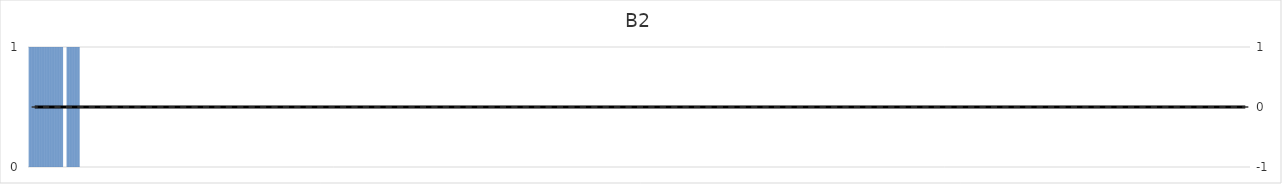
| Category | B2 |
|---|---|
| 1.0 | 0 |
| 2.0 | 1 |
| 3.0 | 1 |
| 4.0 | 1 |
| 5.0 | 1 |
| 6.0 | 1 |
| 7.0 | 1 |
| 8.0 | 1 |
| 9.0 | 1 |
| 10.0 | 1 |
| 11.0 | 1 |
| 12.0 | 1 |
| 13.0 | 1 |
| 14.0 | 1 |
| 15.0 | 1 |
| 16.0 | 1 |
| 17.0 | 1 |
| 18.0 | 1 |
| 19.0 | 1 |
| 20.0 | 1 |
| 21.0 | 1 |
| 22.0 | 1 |
| 23.0 | 1 |
| 24.0 | 1 |
| 25.0 | 1 |
| 26.0 | 1 |
| 27.0 | 1 |
| 28.0 | 1 |
| 29.0 | 1 |
| 30.0 | 1 |
| 31.0 | 1 |
| 32.0 | 1 |
| 33.0 | 1 |
| 34.0 | 1 |
| 35.0 | 1 |
| 36.0 | 1 |
| 37.0 | 1 |
| 38.0 | 1 |
| 39.0 | 1 |
| 40.0 | 1 |
| 41.0 | 1 |
| 42.0 | 1 |
| 43.0 | 1 |
| 44.0 | 1 |
| 45.0 | 1 |
| 46.0 | 1 |
| 47.0 | 1 |
| 48.0 | 1 |
| 49.0 | 1 |
| 50.0 | 0 |
| 51.0 | 0 |
| 52.0 | 0 |
| 53.0 | 0 |
| 54.0 | 0 |
| 55.0 | 1 |
| 56.0 | 1 |
| 57.0 | 1 |
| 58.0 | 1 |
| 59.0 | 1 |
| 60.0 | 1 |
| 61.0 | 1 |
| 62.0 | 1 |
| 63.0 | 1 |
| 64.0 | 1 |
| 65.0 | 1 |
| 66.0 | 1 |
| 67.0 | 1 |
| 68.0 | 1 |
| 69.0 | 1 |
| 70.0 | 1 |
| 71.0 | 1 |
| 72.0 | 1 |
| 73.0 | 0 |
| 74.0 | 0 |
| 75.0 | 0 |
| 76.0 | 0 |
| 77.0 | 0 |
| 78.0 | 0 |
| 79.0 | 0 |
| 80.0 | 0 |
| 81.0 | 0 |
| 82.0 | 0 |
| 83.0 | 0 |
| 84.0 | 0 |
| 85.0 | 0 |
| 86.0 | 0 |
| 87.0 | 0 |
| 88.0 | 0 |
| 89.0 | 0 |
| 90.0 | 0 |
| 91.0 | 0 |
| 92.0 | 0 |
| 93.0 | 0 |
| 94.0 | 0 |
| 95.0 | 0 |
| 96.0 | 0 |
| 97.0 | 0 |
| 98.0 | 0 |
| 99.0 | 0 |
| 100.0 | 0 |
| 101.0 | 0 |
| 102.0 | 0 |
| 103.0 | 0 |
| 104.0 | 0 |
| 105.0 | 0 |
| 106.0 | 0 |
| 107.0 | 0 |
| 108.0 | 0 |
| 109.0 | 0 |
| 110.0 | 0 |
| 111.0 | 0 |
| 112.0 | 0 |
| 113.0 | 0 |
| 114.0 | 0 |
| 115.0 | 0 |
| 116.0 | 0 |
| 117.0 | 0 |
| 118.0 | 0 |
| 119.0 | 0 |
| 120.0 | 0 |
| 121.0 | 0 |
| 122.0 | 0 |
| 123.0 | 0 |
| 124.0 | 0 |
| 125.0 | 0 |
| 126.0 | 0 |
| 127.0 | 0 |
| 128.0 | 0 |
| 129.0 | 0 |
| 130.0 | 0 |
| 131.0 | 0 |
| 132.0 | 0 |
| 133.0 | 0 |
| 134.0 | 0 |
| 135.0 | 0 |
| 136.0 | 0 |
| 137.0 | 0 |
| 138.0 | 0 |
| 139.0 | 0 |
| 140.0 | 0 |
| 141.0 | 0 |
| 142.0 | 0 |
| 143.0 | 0 |
| 144.0 | 0 |
| 145.0 | 0 |
| 146.0 | 0 |
| 147.0 | 0 |
| 148.0 | 0 |
| 149.0 | 0 |
| 150.0 | 0 |
| 151.0 | 0 |
| 152.0 | 0 |
| 153.0 | 0 |
| 154.0 | 0 |
| 155.0 | 0 |
| 156.0 | 0 |
| 157.0 | 0 |
| 158.0 | 0 |
| 159.0 | 0 |
| 160.0 | 0 |
| 161.0 | 0 |
| 162.0 | 0 |
| 163.0 | 0 |
| 164.0 | 0 |
| 165.0 | 0 |
| 166.0 | 0 |
| 167.0 | 0 |
| 168.0 | 0 |
| 169.0 | 0 |
| 170.0 | 0 |
| 171.0 | 0 |
| 172.0 | 0 |
| 173.0 | 0 |
| 174.0 | 0 |
| 175.0 | 0 |
| 176.0 | 0 |
| 177.0 | 0 |
| 178.0 | 0 |
| 179.0 | 0 |
| 180.0 | 0 |
| 181.0 | 0 |
| 182.0 | 0 |
| 183.0 | 0 |
| 184.0 | 0 |
| 185.0 | 0 |
| 186.0 | 0 |
| 187.0 | 0 |
| 188.0 | 0 |
| 189.0 | 0 |
| 190.0 | 0 |
| 191.0 | 0 |
| 192.0 | 0 |
| 193.0 | 0 |
| 194.0 | 0 |
| 195.0 | 0 |
| 196.0 | 0 |
| 197.0 | 0 |
| 198.0 | 0 |
| 199.0 | 0 |
| 200.0 | 0 |
| 201.0 | 0 |
| 202.0 | 0 |
| 203.0 | 0 |
| 204.0 | 0 |
| 205.0 | 0 |
| 206.0 | 0 |
| 207.0 | 0 |
| 208.0 | 0 |
| 209.0 | 0 |
| 210.0 | 0 |
| 211.0 | 0 |
| 212.0 | 0 |
| 213.0 | 0 |
| 214.0 | 0 |
| 215.0 | 0 |
| 216.0 | 0 |
| 217.0 | 0 |
| 218.0 | 0 |
| 219.0 | 0 |
| 220.0 | 0 |
| 221.0 | 0 |
| 222.0 | 0 |
| 223.0 | 0 |
| 224.0 | 0 |
| 225.0 | 0 |
| 226.0 | 0 |
| 227.0 | 0 |
| 228.0 | 0 |
| 229.0 | 0 |
| 230.0 | 0 |
| 231.0 | 0 |
| 232.0 | 0 |
| 233.0 | 0 |
| 234.0 | 0 |
| 235.0 | 0 |
| 236.0 | 0 |
| 237.0 | 0 |
| 238.0 | 0 |
| 239.0 | 0 |
| 240.0 | 0 |
| 241.0 | 0 |
| 242.0 | 0 |
| 243.0 | 0 |
| 244.0 | 0 |
| 245.0 | 0 |
| 246.0 | 0 |
| 247.0 | 0 |
| 248.0 | 0 |
| 249.0 | 0 |
| 250.0 | 0 |
| 251.0 | 0 |
| 252.0 | 0 |
| 253.0 | 0 |
| 254.0 | 0 |
| 255.0 | 0 |
| 256.0 | 0 |
| 257.0 | 0 |
| 258.0 | 0 |
| 259.0 | 0 |
| 260.0 | 0 |
| 261.0 | 0 |
| 262.0 | 0 |
| 263.0 | 0 |
| 264.0 | 0 |
| 265.0 | 0 |
| 266.0 | 0 |
| 267.0 | 0 |
| 268.0 | 0 |
| 269.0 | 0 |
| 270.0 | 0 |
| 271.0 | 0 |
| 272.0 | 0 |
| 273.0 | 0 |
| 274.0 | 0 |
| 275.0 | 0 |
| 276.0 | 0 |
| 277.0 | 0 |
| 278.0 | 0 |
| 279.0 | 0 |
| 280.0 | 0 |
| 281.0 | 0 |
| 282.0 | 0 |
| 283.0 | 0 |
| 284.0 | 0 |
| 285.0 | 0 |
| 286.0 | 0 |
| 287.0 | 0 |
| 288.0 | 0 |
| 289.0 | 0 |
| 290.0 | 0 |
| 291.0 | 0 |
| 292.0 | 0 |
| 293.0 | 0 |
| 294.0 | 0 |
| 295.0 | 0 |
| 296.0 | 0 |
| 297.0 | 0 |
| 298.0 | 0 |
| 299.0 | 0 |
| 300.0 | 0 |
| 301.0 | 0 |
| 302.0 | 0 |
| 303.0 | 0 |
| 304.0 | 0 |
| 305.0 | 0 |
| 306.0 | 0 |
| 307.0 | 0 |
| 308.0 | 0 |
| 309.0 | 0 |
| 310.0 | 0 |
| 311.0 | 0 |
| 312.0 | 0 |
| 313.0 | 0 |
| 314.0 | 0 |
| 315.0 | 0 |
| 316.0 | 0 |
| 317.0 | 0 |
| 318.0 | 0 |
| 319.0 | 0 |
| 320.0 | 0 |
| 321.0 | 0 |
| 322.0 | 0 |
| 323.0 | 0 |
| 324.0 | 0 |
| 325.0 | 0 |
| 326.0 | 0 |
| 327.0 | 0 |
| 328.0 | 0 |
| 329.0 | 0 |
| 330.0 | 0 |
| 331.0 | 0 |
| 332.0 | 0 |
| 333.0 | 0 |
| 334.0 | 0 |
| 335.0 | 0 |
| 336.0 | 0 |
| 337.0 | 0 |
| 338.0 | 0 |
| 339.0 | 0 |
| 340.0 | 0 |
| 341.0 | 0 |
| 342.0 | 0 |
| 343.0 | 0 |
| 344.0 | 0 |
| 345.0 | 0 |
| 346.0 | 0 |
| 347.0 | 0 |
| 348.0 | 0 |
| 349.0 | 0 |
| 350.0 | 0 |
| 351.0 | 0 |
| 352.0 | 0 |
| 353.0 | 0 |
| 354.0 | 0 |
| 355.0 | 0 |
| 356.0 | 0 |
| 357.0 | 0 |
| 358.0 | 0 |
| 359.0 | 0 |
| 360.0 | 0 |
| 361.0 | 0 |
| 362.0 | 0 |
| 363.0 | 0 |
| 364.0 | 0 |
| 365.0 | 0 |
| 366.0 | 0 |
| 367.0 | 0 |
| 368.0 | 0 |
| 369.0 | 0 |
| 370.0 | 0 |
| 371.0 | 0 |
| 372.0 | 0 |
| 373.0 | 0 |
| 374.0 | 0 |
| 375.0 | 0 |
| 376.0 | 0 |
| 377.0 | 0 |
| 378.0 | 0 |
| 379.0 | 0 |
| 380.0 | 0 |
| 381.0 | 0 |
| 382.0 | 0 |
| 383.0 | 0 |
| 384.0 | 0 |
| 385.0 | 0 |
| 386.0 | 0 |
| 387.0 | 0 |
| 388.0 | 0 |
| 389.0 | 0 |
| 390.0 | 0 |
| 391.0 | 0 |
| 392.0 | 0 |
| 393.0 | 0 |
| 394.0 | 0 |
| 395.0 | 0 |
| 396.0 | 0 |
| 397.0 | 0 |
| 398.0 | 0 |
| 399.0 | 0 |
| 400.0 | 0 |
| 401.0 | 0 |
| 402.0 | 0 |
| 403.0 | 0 |
| 404.0 | 0 |
| 405.0 | 0 |
| 406.0 | 0 |
| 407.0 | 0 |
| 408.0 | 0 |
| 409.0 | 0 |
| 410.0 | 0 |
| 411.0 | 0 |
| 412.0 | 0 |
| 413.0 | 0 |
| 414.0 | 0 |
| 415.0 | 0 |
| 416.0 | 0 |
| 417.0 | 0 |
| 418.0 | 0 |
| 419.0 | 0 |
| 420.0 | 0 |
| 421.0 | 0 |
| 422.0 | 0 |
| 423.0 | 0 |
| 424.0 | 0 |
| 425.0 | 0 |
| 426.0 | 0 |
| 427.0 | 0 |
| 428.0 | 0 |
| 429.0 | 0 |
| 430.0 | 0 |
| 431.0 | 0 |
| 432.0 | 0 |
| 433.0 | 0 |
| 434.0 | 0 |
| 435.0 | 0 |
| 436.0 | 0 |
| 437.0 | 0 |
| 438.0 | 0 |
| 439.0 | 0 |
| 440.0 | 0 |
| 441.0 | 0 |
| 442.0 | 0 |
| 443.0 | 0 |
| 444.0 | 0 |
| 445.0 | 0 |
| 446.0 | 0 |
| 447.0 | 0 |
| 448.0 | 0 |
| 449.0 | 0 |
| 450.0 | 0 |
| 451.0 | 0 |
| 452.0 | 0 |
| 453.0 | 0 |
| 454.0 | 0 |
| 455.0 | 0 |
| 456.0 | 0 |
| 457.0 | 0 |
| 458.0 | 0 |
| 459.0 | 0 |
| 460.0 | 0 |
| 461.0 | 0 |
| 462.0 | 0 |
| 463.0 | 0 |
| 464.0 | 0 |
| 465.0 | 0 |
| 466.0 | 0 |
| 467.0 | 0 |
| 468.0 | 0 |
| 469.0 | 0 |
| 470.0 | 0 |
| 471.0 | 0 |
| 472.0 | 0 |
| 473.0 | 0 |
| 474.0 | 0 |
| 475.0 | 0 |
| 476.0 | 0 |
| 477.0 | 0 |
| 478.0 | 0 |
| 479.0 | 0 |
| 480.0 | 0 |
| 481.0 | 0 |
| 482.0 | 0 |
| 483.0 | 0 |
| 484.0 | 0 |
| 485.0 | 0 |
| 486.0 | 0 |
| 487.0 | 0 |
| 488.0 | 0 |
| 489.0 | 0 |
| 490.0 | 0 |
| 491.0 | 0 |
| 492.0 | 0 |
| 493.0 | 0 |
| 494.0 | 0 |
| 495.0 | 0 |
| 496.0 | 0 |
| 497.0 | 0 |
| 498.0 | 0 |
| 499.0 | 0 |
| 500.0 | 0 |
| 501.0 | 0 |
| 502.0 | 0 |
| 503.0 | 0 |
| 504.0 | 0 |
| 505.0 | 0 |
| 506.0 | 0 |
| 507.0 | 0 |
| 508.0 | 0 |
| 509.0 | 0 |
| 510.0 | 0 |
| 511.0 | 0 |
| 512.0 | 0 |
| 513.0 | 0 |
| 514.0 | 0 |
| 515.0 | 0 |
| 516.0 | 0 |
| 517.0 | 0 |
| 518.0 | 0 |
| 519.0 | 0 |
| 520.0 | 0 |
| 521.0 | 0 |
| 522.0 | 0 |
| 523.0 | 0 |
| 524.0 | 0 |
| 525.0 | 0 |
| 526.0 | 0 |
| 527.0 | 0 |
| 528.0 | 0 |
| 529.0 | 0 |
| 530.0 | 0 |
| 531.0 | 0 |
| 532.0 | 0 |
| 533.0 | 0 |
| 534.0 | 0 |
| 535.0 | 0 |
| 536.0 | 0 |
| 537.0 | 0 |
| 538.0 | 0 |
| 539.0 | 0 |
| 540.0 | 0 |
| 541.0 | 0 |
| 542.0 | 0 |
| 543.0 | 0 |
| 544.0 | 0 |
| 545.0 | 0 |
| 546.0 | 0 |
| 547.0 | 0 |
| 548.0 | 0 |
| 549.0 | 0 |
| 550.0 | 0 |
| 551.0 | 0 |
| 552.0 | 0 |
| 553.0 | 0 |
| 554.0 | 0 |
| 555.0 | 0 |
| 556.0 | 0 |
| 557.0 | 0 |
| 558.0 | 0 |
| 559.0 | 0 |
| 560.0 | 0 |
| 561.0 | 0 |
| 562.0 | 0 |
| 563.0 | 0 |
| 564.0 | 0 |
| 565.0 | 0 |
| 566.0 | 0 |
| 567.0 | 0 |
| 568.0 | 0 |
| 569.0 | 0 |
| 570.0 | 0 |
| 571.0 | 0 |
| 572.0 | 0 |
| 573.0 | 0 |
| 574.0 | 0 |
| 575.0 | 0 |
| 576.0 | 0 |
| 577.0 | 0 |
| 578.0 | 0 |
| 579.0 | 0 |
| 580.0 | 0 |
| 581.0 | 0 |
| 582.0 | 0 |
| 583.0 | 0 |
| 584.0 | 0 |
| 585.0 | 0 |
| 586.0 | 0 |
| 587.0 | 0 |
| 588.0 | 0 |
| 589.0 | 0 |
| 590.0 | 0 |
| 591.0 | 0 |
| 592.0 | 0 |
| 593.0 | 0 |
| 594.0 | 0 |
| 595.0 | 0 |
| 596.0 | 0 |
| 597.0 | 0 |
| 598.0 | 0 |
| 599.0 | 0 |
| 600.0 | 0 |
| 601.0 | 0 |
| 602.0 | 0 |
| 603.0 | 0 |
| 604.0 | 0 |
| 605.0 | 0 |
| 606.0 | 0 |
| 607.0 | 0 |
| 608.0 | 0 |
| 609.0 | 0 |
| 610.0 | 0 |
| 611.0 | 0 |
| 612.0 | 0 |
| 613.0 | 0 |
| 614.0 | 0 |
| 615.0 | 0 |
| 616.0 | 0 |
| 617.0 | 0 |
| 618.0 | 0 |
| 619.0 | 0 |
| 620.0 | 0 |
| 621.0 | 0 |
| 622.0 | 0 |
| 623.0 | 0 |
| 624.0 | 0 |
| 625.0 | 0 |
| 626.0 | 0 |
| 627.0 | 0 |
| 628.0 | 0 |
| 629.0 | 0 |
| 630.0 | 0 |
| 631.0 | 0 |
| 632.0 | 0 |
| 633.0 | 0 |
| 634.0 | 0 |
| 635.0 | 0 |
| 636.0 | 0 |
| 637.0 | 0 |
| 638.0 | 0 |
| 639.0 | 0 |
| 640.0 | 0 |
| 641.0 | 0 |
| 642.0 | 0 |
| 643.0 | 0 |
| 644.0 | 0 |
| 645.0 | 0 |
| 646.0 | 0 |
| 647.0 | 0 |
| 648.0 | 0 |
| 649.0 | 0 |
| 650.0 | 0 |
| 651.0 | 0 |
| 652.0 | 0 |
| 653.0 | 0 |
| 654.0 | 0 |
| 655.0 | 0 |
| 656.0 | 0 |
| 657.0 | 0 |
| 658.0 | 0 |
| 659.0 | 0 |
| 660.0 | 0 |
| 661.0 | 0 |
| 662.0 | 0 |
| 663.0 | 0 |
| 664.0 | 0 |
| 665.0 | 0 |
| 666.0 | 0 |
| 667.0 | 0 |
| 668.0 | 0 |
| 669.0 | 0 |
| 670.0 | 0 |
| 671.0 | 0 |
| 672.0 | 0 |
| 673.0 | 0 |
| 674.0 | 0 |
| 675.0 | 0 |
| 676.0 | 0 |
| 677.0 | 0 |
| 678.0 | 0 |
| 679.0 | 0 |
| 680.0 | 0 |
| 681.0 | 0 |
| 682.0 | 0 |
| 683.0 | 0 |
| 684.0 | 0 |
| 685.0 | 0 |
| 686.0 | 0 |
| 687.0 | 0 |
| 688.0 | 0 |
| 689.0 | 0 |
| 690.0 | 0 |
| 691.0 | 0 |
| 692.0 | 0 |
| 693.0 | 0 |
| 694.0 | 0 |
| 695.0 | 0 |
| 696.0 | 0 |
| 697.0 | 0 |
| 698.0 | 0 |
| 699.0 | 0 |
| 700.0 | 0 |
| 701.0 | 0 |
| 702.0 | 0 |
| 703.0 | 0 |
| 704.0 | 0 |
| 705.0 | 0 |
| 706.0 | 0 |
| 707.0 | 0 |
| 708.0 | 0 |
| 709.0 | 0 |
| 710.0 | 0 |
| 711.0 | 0 |
| 712.0 | 0 |
| 713.0 | 0 |
| 714.0 | 0 |
| 715.0 | 0 |
| 716.0 | 0 |
| 717.0 | 0 |
| 718.0 | 0 |
| 719.0 | 0 |
| 720.0 | 0 |
| 721.0 | 0 |
| 722.0 | 0 |
| 723.0 | 0 |
| 724.0 | 0 |
| 725.0 | 0 |
| 726.0 | 0 |
| 727.0 | 0 |
| 728.0 | 0 |
| 729.0 | 0 |
| 730.0 | 0 |
| 731.0 | 0 |
| 732.0 | 0 |
| 733.0 | 0 |
| 734.0 | 0 |
| 735.0 | 0 |
| 736.0 | 0 |
| 737.0 | 0 |
| 738.0 | 0 |
| 739.0 | 0 |
| 740.0 | 0 |
| 741.0 | 0 |
| 742.0 | 0 |
| 743.0 | 0 |
| 744.0 | 0 |
| 745.0 | 0 |
| 746.0 | 0 |
| 747.0 | 0 |
| 748.0 | 0 |
| 749.0 | 0 |
| 750.0 | 0 |
| 751.0 | 0 |
| 752.0 | 0 |
| 753.0 | 0 |
| 754.0 | 0 |
| 755.0 | 0 |
| 756.0 | 0 |
| 757.0 | 0 |
| 758.0 | 0 |
| 759.0 | 0 |
| 760.0 | 0 |
| 761.0 | 0 |
| 762.0 | 0 |
| 763.0 | 0 |
| 764.0 | 0 |
| 765.0 | 0 |
| 766.0 | 0 |
| 767.0 | 0 |
| 768.0 | 0 |
| 769.0 | 0 |
| 770.0 | 0 |
| 771.0 | 0 |
| 772.0 | 0 |
| 773.0 | 0 |
| 774.0 | 0 |
| 775.0 | 0 |
| 776.0 | 0 |
| 777.0 | 0 |
| 778.0 | 0 |
| 779.0 | 0 |
| 780.0 | 0 |
| 781.0 | 0 |
| 782.0 | 0 |
| 783.0 | 0 |
| 784.0 | 0 |
| 785.0 | 0 |
| 786.0 | 0 |
| 787.0 | 0 |
| 788.0 | 0 |
| 789.0 | 0 |
| 790.0 | 0 |
| 791.0 | 0 |
| 792.0 | 0 |
| 793.0 | 0 |
| 794.0 | 0 |
| 795.0 | 0 |
| 796.0 | 0 |
| 797.0 | 0 |
| 798.0 | 0 |
| 799.0 | 0 |
| 800.0 | 0 |
| 801.0 | 0 |
| 802.0 | 0 |
| 803.0 | 0 |
| 804.0 | 0 |
| 805.0 | 0 |
| 806.0 | 0 |
| 807.0 | 0 |
| 808.0 | 0 |
| 809.0 | 0 |
| 810.0 | 0 |
| 811.0 | 0 |
| 812.0 | 0 |
| 813.0 | 0 |
| 814.0 | 0 |
| 815.0 | 0 |
| 816.0 | 0 |
| 817.0 | 0 |
| 818.0 | 0 |
| 819.0 | 0 |
| 820.0 | 0 |
| 821.0 | 0 |
| 822.0 | 0 |
| 823.0 | 0 |
| 824.0 | 0 |
| 825.0 | 0 |
| 826.0 | 0 |
| 827.0 | 0 |
| 828.0 | 0 |
| 829.0 | 0 |
| 830.0 | 0 |
| 831.0 | 0 |
| 832.0 | 0 |
| 833.0 | 0 |
| 834.0 | 0 |
| 835.0 | 0 |
| 836.0 | 0 |
| 837.0 | 0 |
| 838.0 | 0 |
| 839.0 | 0 |
| 840.0 | 0 |
| 841.0 | 0 |
| 842.0 | 0 |
| 843.0 | 0 |
| 844.0 | 0 |
| 845.0 | 0 |
| 846.0 | 0 |
| 847.0 | 0 |
| 848.0 | 0 |
| 849.0 | 0 |
| 850.0 | 0 |
| 851.0 | 0 |
| 852.0 | 0 |
| 853.0 | 0 |
| 854.0 | 0 |
| 855.0 | 0 |
| 856.0 | 0 |
| 857.0 | 0 |
| 858.0 | 0 |
| 859.0 | 0 |
| 860.0 | 0 |
| 861.0 | 0 |
| 862.0 | 0 |
| 863.0 | 0 |
| 864.0 | 0 |
| 865.0 | 0 |
| 866.0 | 0 |
| 867.0 | 0 |
| 868.0 | 0 |
| 869.0 | 0 |
| 870.0 | 0 |
| 871.0 | 0 |
| 872.0 | 0 |
| 873.0 | 0 |
| 874.0 | 0 |
| 875.0 | 0 |
| 876.0 | 0 |
| 877.0 | 0 |
| 878.0 | 0 |
| 879.0 | 0 |
| 880.0 | 0 |
| 881.0 | 0 |
| 882.0 | 0 |
| 883.0 | 0 |
| 884.0 | 0 |
| 885.0 | 0 |
| 886.0 | 0 |
| 887.0 | 0 |
| 888.0 | 0 |
| 889.0 | 0 |
| 890.0 | 0 |
| 891.0 | 0 |
| 892.0 | 0 |
| 893.0 | 0 |
| 894.0 | 0 |
| 895.0 | 0 |
| 896.0 | 0 |
| 897.0 | 0 |
| 898.0 | 0 |
| 899.0 | 0 |
| 900.0 | 0 |
| 901.0 | 0 |
| 902.0 | 0 |
| 903.0 | 0 |
| 904.0 | 0 |
| 905.0 | 0 |
| 906.0 | 0 |
| 907.0 | 0 |
| 908.0 | 0 |
| 909.0 | 0 |
| 910.0 | 0 |
| 911.0 | 0 |
| 912.0 | 0 |
| 913.0 | 0 |
| 914.0 | 0 |
| 915.0 | 0 |
| 916.0 | 0 |
| 917.0 | 0 |
| 918.0 | 0 |
| 919.0 | 0 |
| 920.0 | 0 |
| 921.0 | 0 |
| 922.0 | 0 |
| 923.0 | 0 |
| 924.0 | 0 |
| 925.0 | 0 |
| 926.0 | 0 |
| 927.0 | 0 |
| 928.0 | 0 |
| 929.0 | 0 |
| 930.0 | 0 |
| 931.0 | 0 |
| 932.0 | 0 |
| 933.0 | 0 |
| 934.0 | 0 |
| 935.0 | 0 |
| 936.0 | 0 |
| 937.0 | 0 |
| 938.0 | 0 |
| 939.0 | 0 |
| 940.0 | 0 |
| 941.0 | 0 |
| 942.0 | 0 |
| 943.0 | 0 |
| 944.0 | 0 |
| 945.0 | 0 |
| 946.0 | 0 |
| 947.0 | 0 |
| 948.0 | 0 |
| 949.0 | 0 |
| 950.0 | 0 |
| 951.0 | 0 |
| 952.0 | 0 |
| 953.0 | 0 |
| 954.0 | 0 |
| 955.0 | 0 |
| 956.0 | 0 |
| 957.0 | 0 |
| 958.0 | 0 |
| 959.0 | 0 |
| 960.0 | 0 |
| 961.0 | 0 |
| 962.0 | 0 |
| 963.0 | 0 |
| 964.0 | 0 |
| 965.0 | 0 |
| 966.0 | 0 |
| 967.0 | 0 |
| 968.0 | 0 |
| 969.0 | 0 |
| 970.0 | 0 |
| 971.0 | 0 |
| 972.0 | 0 |
| 973.0 | 0 |
| 974.0 | 0 |
| 975.0 | 0 |
| 976.0 | 0 |
| 977.0 | 0 |
| 978.0 | 0 |
| 979.0 | 0 |
| 980.0 | 0 |
| 981.0 | 0 |
| 982.0 | 0 |
| 983.0 | 0 |
| 984.0 | 0 |
| 985.0 | 0 |
| 986.0 | 0 |
| 987.0 | 0 |
| 988.0 | 0 |
| 989.0 | 0 |
| 990.0 | 0 |
| 991.0 | 0 |
| 992.0 | 0 |
| 993.0 | 0 |
| 994.0 | 0 |
| 995.0 | 0 |
| 996.0 | 0 |
| 997.0 | 0 |
| 998.0 | 0 |
| 999.0 | 0 |
| 1000.0 | 0 |
| 1001.0 | 0 |
| 1002.0 | 0 |
| 1003.0 | 0 |
| 1004.0 | 0 |
| 1005.0 | 0 |
| 1006.0 | 0 |
| 1007.0 | 0 |
| 1008.0 | 0 |
| 1009.0 | 0 |
| 1010.0 | 0 |
| 1011.0 | 0 |
| 1012.0 | 0 |
| 1013.0 | 0 |
| 1014.0 | 0 |
| 1015.0 | 0 |
| 1016.0 | 0 |
| 1017.0 | 0 |
| 1018.0 | 0 |
| 1019.0 | 0 |
| 1020.0 | 0 |
| 1021.0 | 0 |
| 1022.0 | 0 |
| 1023.0 | 0 |
| 1024.0 | 0 |
| 1025.0 | 0 |
| 1026.0 | 0 |
| 1027.0 | 0 |
| 1028.0 | 0 |
| 1029.0 | 0 |
| 1030.0 | 0 |
| 1031.0 | 0 |
| 1032.0 | 0 |
| 1033.0 | 0 |
| 1034.0 | 0 |
| 1035.0 | 0 |
| 1036.0 | 0 |
| 1037.0 | 0 |
| 1038.0 | 0 |
| 1039.0 | 0 |
| 1040.0 | 0 |
| 1041.0 | 0 |
| 1042.0 | 0 |
| 1043.0 | 0 |
| 1044.0 | 0 |
| 1045.0 | 0 |
| 1046.0 | 0 |
| 1047.0 | 0 |
| 1048.0 | 0 |
| 1049.0 | 0 |
| 1050.0 | 0 |
| 1051.0 | 0 |
| 1052.0 | 0 |
| 1053.0 | 0 |
| 1054.0 | 0 |
| 1055.0 | 0 |
| 1056.0 | 0 |
| 1057.0 | 0 |
| 1058.0 | 0 |
| 1059.0 | 0 |
| 1060.0 | 0 |
| 1061.0 | 0 |
| 1062.0 | 0 |
| 1063.0 | 0 |
| 1064.0 | 0 |
| 1065.0 | 0 |
| 1066.0 | 0 |
| 1067.0 | 0 |
| 1068.0 | 0 |
| 1069.0 | 0 |
| 1070.0 | 0 |
| 1071.0 | 0 |
| 1072.0 | 0 |
| 1073.0 | 0 |
| 1074.0 | 0 |
| 1075.0 | 0 |
| 1076.0 | 0 |
| 1077.0 | 0 |
| 1078.0 | 0 |
| 1079.0 | 0 |
| 1080.0 | 0 |
| 1081.0 | 0 |
| 1082.0 | 0 |
| 1083.0 | 0 |
| 1084.0 | 0 |
| 1085.0 | 0 |
| 1086.0 | 0 |
| 1087.0 | 0 |
| 1088.0 | 0 |
| 1089.0 | 0 |
| 1090.0 | 0 |
| 1091.0 | 0 |
| 1092.0 | 0 |
| 1093.0 | 0 |
| 1094.0 | 0 |
| 1095.0 | 0 |
| 1096.0 | 0 |
| 1097.0 | 0 |
| 1098.0 | 0 |
| 1099.0 | 0 |
| 1100.0 | 0 |
| 1101.0 | 0 |
| 1102.0 | 0 |
| 1103.0 | 0 |
| 1104.0 | 0 |
| 1105.0 | 0 |
| 1106.0 | 0 |
| 1107.0 | 0 |
| 1108.0 | 0 |
| 1109.0 | 0 |
| 1110.0 | 0 |
| 1111.0 | 0 |
| 1112.0 | 0 |
| 1113.0 | 0 |
| 1114.0 | 0 |
| 1115.0 | 0 |
| 1116.0 | 0 |
| 1117.0 | 0 |
| 1118.0 | 0 |
| 1119.0 | 0 |
| 1120.0 | 0 |
| 1121.0 | 0 |
| 1122.0 | 0 |
| 1123.0 | 0 |
| 1124.0 | 0 |
| 1125.0 | 0 |
| 1126.0 | 0 |
| 1127.0 | 0 |
| 1128.0 | 0 |
| 1129.0 | 0 |
| 1130.0 | 0 |
| 1131.0 | 0 |
| 1132.0 | 0 |
| 1133.0 | 0 |
| 1134.0 | 0 |
| 1135.0 | 0 |
| 1136.0 | 0 |
| 1137.0 | 0 |
| 1138.0 | 0 |
| 1139.0 | 0 |
| 1140.0 | 0 |
| 1141.0 | 0 |
| 1142.0 | 0 |
| 1143.0 | 0 |
| 1144.0 | 0 |
| 1145.0 | 0 |
| 1146.0 | 0 |
| 1147.0 | 0 |
| 1148.0 | 0 |
| 1149.0 | 0 |
| 1150.0 | 0 |
| 1151.0 | 0 |
| 1152.0 | 0 |
| 1153.0 | 0 |
| 1154.0 | 0 |
| 1155.0 | 0 |
| 1156.0 | 0 |
| 1157.0 | 0 |
| 1158.0 | 0 |
| 1159.0 | 0 |
| 1160.0 | 0 |
| 1161.0 | 0 |
| 1162.0 | 0 |
| 1163.0 | 0 |
| 1164.0 | 0 |
| 1165.0 | 0 |
| 1166.0 | 0 |
| 1167.0 | 0 |
| 1168.0 | 0 |
| 1169.0 | 0 |
| 1170.0 | 0 |
| 1171.0 | 0 |
| 1172.0 | 0 |
| 1173.0 | 0 |
| 1174.0 | 0 |
| 1175.0 | 0 |
| 1176.0 | 0 |
| 1177.0 | 0 |
| 1178.0 | 0 |
| 1179.0 | 0 |
| 1180.0 | 0 |
| 1181.0 | 0 |
| 1182.0 | 0 |
| 1183.0 | 0 |
| 1184.0 | 0 |
| 1185.0 | 0 |
| 1186.0 | 0 |
| 1187.0 | 0 |
| 1188.0 | 0 |
| 1189.0 | 0 |
| 1190.0 | 0 |
| 1191.0 | 0 |
| 1192.0 | 0 |
| 1193.0 | 0 |
| 1194.0 | 0 |
| 1195.0 | 0 |
| 1196.0 | 0 |
| 1197.0 | 0 |
| 1198.0 | 0 |
| 1199.0 | 0 |
| 1200.0 | 0 |
| 1201.0 | 0 |
| 1202.0 | 0 |
| 1203.0 | 0 |
| 1204.0 | 0 |
| 1205.0 | 0 |
| 1206.0 | 0 |
| 1207.0 | 0 |
| 1208.0 | 0 |
| 1209.0 | 0 |
| 1210.0 | 0 |
| 1211.0 | 0 |
| 1212.0 | 0 |
| 1213.0 | 0 |
| 1214.0 | 0 |
| 1215.0 | 0 |
| 1216.0 | 0 |
| 1217.0 | 0 |
| 1218.0 | 0 |
| 1219.0 | 0 |
| 1220.0 | 0 |
| 1221.0 | 0 |
| 1222.0 | 0 |
| 1223.0 | 0 |
| 1224.0 | 0 |
| 1225.0 | 0 |
| 1226.0 | 0 |
| 1227.0 | 0 |
| 1228.0 | 0 |
| 1229.0 | 0 |
| 1230.0 | 0 |
| 1231.0 | 0 |
| 1232.0 | 0 |
| 1233.0 | 0 |
| 1234.0 | 0 |
| 1235.0 | 0 |
| 1236.0 | 0 |
| 1237.0 | 0 |
| 1238.0 | 0 |
| 1239.0 | 0 |
| 1240.0 | 0 |
| 1241.0 | 0 |
| 1242.0 | 0 |
| 1243.0 | 0 |
| 1244.0 | 0 |
| 1245.0 | 0 |
| 1246.0 | 0 |
| 1247.0 | 0 |
| 1248.0 | 0 |
| 1249.0 | 0 |
| 1250.0 | 0 |
| 1251.0 | 0 |
| 1252.0 | 0 |
| 1253.0 | 0 |
| 1254.0 | 0 |
| 1255.0 | 0 |
| 1256.0 | 0 |
| 1257.0 | 0 |
| 1258.0 | 0 |
| 1259.0 | 0 |
| 1260.0 | 0 |
| 1261.0 | 0 |
| 1262.0 | 0 |
| 1263.0 | 0 |
| 1264.0 | 0 |
| 1265.0 | 0 |
| 1266.0 | 0 |
| 1267.0 | 0 |
| 1268.0 | 0 |
| 1269.0 | 0 |
| 1270.0 | 0 |
| 1271.0 | 0 |
| 1272.0 | 0 |
| 1273.0 | 0 |
| 1274.0 | 0 |
| 1275.0 | 0 |
| 1276.0 | 0 |
| 1277.0 | 0 |
| 1278.0 | 0 |
| 1279.0 | 0 |
| 1280.0 | 0 |
| 1281.0 | 0 |
| 1282.0 | 0 |
| 1283.0 | 0 |
| 1284.0 | 0 |
| 1285.0 | 0 |
| 1286.0 | 0 |
| 1287.0 | 0 |
| 1288.0 | 0 |
| 1289.0 | 0 |
| 1290.0 | 0 |
| 1291.0 | 0 |
| 1292.0 | 0 |
| 1293.0 | 0 |
| 1294.0 | 0 |
| 1295.0 | 0 |
| 1296.0 | 0 |
| 1297.0 | 0 |
| 1298.0 | 0 |
| 1299.0 | 0 |
| 1300.0 | 0 |
| 1301.0 | 0 |
| 1302.0 | 0 |
| 1303.0 | 0 |
| 1304.0 | 0 |
| 1305.0 | 0 |
| 1306.0 | 0 |
| 1307.0 | 0 |
| 1308.0 | 0 |
| 1309.0 | 0 |
| 1310.0 | 0 |
| 1311.0 | 0 |
| 1312.0 | 0 |
| 1313.0 | 0 |
| 1314.0 | 0 |
| 1315.0 | 0 |
| 1316.0 | 0 |
| 1317.0 | 0 |
| 1318.0 | 0 |
| 1319.0 | 0 |
| 1320.0 | 0 |
| 1321.0 | 0 |
| 1322.0 | 0 |
| 1323.0 | 0 |
| 1324.0 | 0 |
| 1325.0 | 0 |
| 1326.0 | 0 |
| 1327.0 | 0 |
| 1328.0 | 0 |
| 1329.0 | 0 |
| 1330.0 | 0 |
| 1331.0 | 0 |
| 1332.0 | 0 |
| 1333.0 | 0 |
| 1334.0 | 0 |
| 1335.0 | 0 |
| 1336.0 | 0 |
| 1337.0 | 0 |
| 1338.0 | 0 |
| 1339.0 | 0 |
| 1340.0 | 0 |
| 1341.0 | 0 |
| 1342.0 | 0 |
| 1343.0 | 0 |
| 1344.0 | 0 |
| 1345.0 | 0 |
| 1346.0 | 0 |
| 1347.0 | 0 |
| 1348.0 | 0 |
| 1349.0 | 0 |
| 1350.0 | 0 |
| 1351.0 | 0 |
| 1352.0 | 0 |
| 1353.0 | 0 |
| 1354.0 | 0 |
| 1355.0 | 0 |
| 1356.0 | 0 |
| 1357.0 | 0 |
| 1358.0 | 0 |
| 1359.0 | 0 |
| 1360.0 | 0 |
| 1361.0 | 0 |
| 1362.0 | 0 |
| 1363.0 | 0 |
| 1364.0 | 0 |
| 1365.0 | 0 |
| 1366.0 | 0 |
| 1367.0 | 0 |
| 1368.0 | 0 |
| 1369.0 | 0 |
| 1370.0 | 0 |
| 1371.0 | 0 |
| 1372.0 | 0 |
| 1373.0 | 0 |
| 1374.0 | 0 |
| 1375.0 | 0 |
| 1376.0 | 0 |
| 1377.0 | 0 |
| 1378.0 | 0 |
| 1379.0 | 0 |
| 1380.0 | 0 |
| 1381.0 | 0 |
| 1382.0 | 0 |
| 1383.0 | 0 |
| 1384.0 | 0 |
| 1385.0 | 0 |
| 1386.0 | 0 |
| 1387.0 | 0 |
| 1388.0 | 0 |
| 1389.0 | 0 |
| 1390.0 | 0 |
| 1391.0 | 0 |
| 1392.0 | 0 |
| 1393.0 | 0 |
| 1394.0 | 0 |
| 1395.0 | 0 |
| 1396.0 | 0 |
| 1397.0 | 0 |
| 1398.0 | 0 |
| 1399.0 | 0 |
| 1400.0 | 0 |
| 1401.0 | 0 |
| 1402.0 | 0 |
| 1403.0 | 0 |
| 1404.0 | 0 |
| 1405.0 | 0 |
| 1406.0 | 0 |
| 1407.0 | 0 |
| 1408.0 | 0 |
| 1409.0 | 0 |
| 1410.0 | 0 |
| 1411.0 | 0 |
| 1412.0 | 0 |
| 1413.0 | 0 |
| 1414.0 | 0 |
| 1415.0 | 0 |
| 1416.0 | 0 |
| 1417.0 | 0 |
| 1418.0 | 0 |
| 1419.0 | 0 |
| 1420.0 | 0 |
| 1421.0 | 0 |
| 1422.0 | 0 |
| 1423.0 | 0 |
| 1424.0 | 0 |
| 1425.0 | 0 |
| 1426.0 | 0 |
| 1427.0 | 0 |
| 1428.0 | 0 |
| 1429.0 | 0 |
| 1430.0 | 0 |
| 1431.0 | 0 |
| 1432.0 | 0 |
| 1433.0 | 0 |
| 1434.0 | 0 |
| 1435.0 | 0 |
| 1436.0 | 0 |
| 1437.0 | 0 |
| 1438.0 | 0 |
| 1439.0 | 0 |
| 1440.0 | 0 |
| 1441.0 | 0 |
| 1442.0 | 0 |
| 1443.0 | 0 |
| 1444.0 | 0 |
| 1445.0 | 0 |
| 1446.0 | 0 |
| 1447.0 | 0 |
| 1448.0 | 0 |
| 1449.0 | 0 |
| 1450.0 | 0 |
| 1451.0 | 0 |
| 1452.0 | 0 |
| 1453.0 | 0 |
| 1454.0 | 0 |
| 1455.0 | 0 |
| 1456.0 | 0 |
| 1457.0 | 0 |
| 1458.0 | 0 |
| 1459.0 | 0 |
| 1460.0 | 0 |
| 1461.0 | 0 |
| 1462.0 | 0 |
| 1463.0 | 0 |
| 1464.0 | 0 |
| 1465.0 | 0 |
| 1466.0 | 0 |
| 1467.0 | 0 |
| 1468.0 | 0 |
| 1469.0 | 0 |
| 1470.0 | 0 |
| 1471.0 | 0 |
| 1472.0 | 0 |
| 1473.0 | 0 |
| 1474.0 | 0 |
| 1475.0 | 0 |
| 1476.0 | 0 |
| 1477.0 | 0 |
| 1478.0 | 0 |
| 1479.0 | 0 |
| 1480.0 | 0 |
| 1481.0 | 0 |
| 1482.0 | 0 |
| 1483.0 | 0 |
| 1484.0 | 0 |
| 1485.0 | 0 |
| 1486.0 | 0 |
| 1487.0 | 0 |
| 1488.0 | 0 |
| 1489.0 | 0 |
| 1490.0 | 0 |
| 1491.0 | 0 |
| 1492.0 | 0 |
| 1493.0 | 0 |
| 1494.0 | 0 |
| 1495.0 | 0 |
| 1496.0 | 0 |
| 1497.0 | 0 |
| 1498.0 | 0 |
| 1499.0 | 0 |
| 1500.0 | 0 |
| 1501.0 | 0 |
| 1502.0 | 0 |
| 1503.0 | 0 |
| 1504.0 | 0 |
| 1505.0 | 0 |
| 1506.0 | 0 |
| 1507.0 | 0 |
| 1508.0 | 0 |
| 1509.0 | 0 |
| 1510.0 | 0 |
| 1511.0 | 0 |
| 1512.0 | 0 |
| 1513.0 | 0 |
| 1514.0 | 0 |
| 1515.0 | 0 |
| 1516.0 | 0 |
| 1517.0 | 0 |
| 1518.0 | 0 |
| 1519.0 | 0 |
| 1520.0 | 0 |
| 1521.0 | 0 |
| 1522.0 | 0 |
| 1523.0 | 0 |
| 1524.0 | 0 |
| 1525.0 | 0 |
| 1526.0 | 0 |
| 1527.0 | 0 |
| 1528.0 | 0 |
| 1529.0 | 0 |
| 1530.0 | 0 |
| 1531.0 | 0 |
| 1532.0 | 0 |
| 1533.0 | 0 |
| 1534.0 | 0 |
| 1535.0 | 0 |
| 1536.0 | 0 |
| 1537.0 | 0 |
| 1538.0 | 0 |
| 1539.0 | 0 |
| 1540.0 | 0 |
| 1541.0 | 0 |
| 1542.0 | 0 |
| 1543.0 | 0 |
| 1544.0 | 0 |
| 1545.0 | 0 |
| 1546.0 | 0 |
| 1547.0 | 0 |
| 1548.0 | 0 |
| 1549.0 | 0 |
| 1550.0 | 0 |
| 1551.0 | 0 |
| 1552.0 | 0 |
| 1553.0 | 0 |
| 1554.0 | 0 |
| 1555.0 | 0 |
| 1556.0 | 0 |
| 1557.0 | 0 |
| 1558.0 | 0 |
| 1559.0 | 0 |
| 1560.0 | 0 |
| 1561.0 | 0 |
| 1562.0 | 0 |
| 1563.0 | 0 |
| 1564.0 | 0 |
| 1565.0 | 0 |
| 1566.0 | 0 |
| 1567.0 | 0 |
| 1568.0 | 0 |
| 1569.0 | 0 |
| 1570.0 | 0 |
| 1571.0 | 0 |
| 1572.0 | 0 |
| 1573.0 | 0 |
| 1574.0 | 0 |
| 1575.0 | 0 |
| 1576.0 | 0 |
| 1577.0 | 0 |
| 1578.0 | 0 |
| 1579.0 | 0 |
| 1580.0 | 0 |
| 1581.0 | 0 |
| 1582.0 | 0 |
| 1583.0 | 0 |
| 1584.0 | 0 |
| 1585.0 | 0 |
| 1586.0 | 0 |
| 1587.0 | 0 |
| 1588.0 | 0 |
| 1589.0 | 0 |
| 1590.0 | 0 |
| 1591.0 | 0 |
| 1592.0 | 0 |
| 1593.0 | 0 |
| 1594.0 | 0 |
| 1595.0 | 0 |
| 1596.0 | 0 |
| 1597.0 | 0 |
| 1598.0 | 0 |
| 1599.0 | 0 |
| 1600.0 | 0 |
| 1601.0 | 0 |
| 1602.0 | 0 |
| 1603.0 | 0 |
| 1604.0 | 0 |
| 1605.0 | 0 |
| 1606.0 | 0 |
| 1607.0 | 0 |
| 1608.0 | 0 |
| 1609.0 | 0 |
| 1610.0 | 0 |
| 1611.0 | 0 |
| 1612.0 | 0 |
| 1613.0 | 0 |
| 1614.0 | 0 |
| 1615.0 | 0 |
| 1616.0 | 0 |
| 1617.0 | 0 |
| 1618.0 | 0 |
| 1619.0 | 0 |
| 1620.0 | 0 |
| 1621.0 | 0 |
| 1622.0 | 0 |
| 1623.0 | 0 |
| 1624.0 | 0 |
| 1625.0 | 0 |
| 1626.0 | 0 |
| 1627.0 | 0 |
| 1628.0 | 0 |
| 1629.0 | 0 |
| 1630.0 | 0 |
| 1631.0 | 0 |
| 1632.0 | 0 |
| 1633.0 | 0 |
| 1634.0 | 0 |
| 1635.0 | 0 |
| 1636.0 | 0 |
| 1637.0 | 0 |
| 1638.0 | 0 |
| 1639.0 | 0 |
| 1640.0 | 0 |
| 1641.0 | 0 |
| 1642.0 | 0 |
| 1643.0 | 0 |
| 1644.0 | 0 |
| 1645.0 | 0 |
| 1646.0 | 0 |
| 1647.0 | 0 |
| 1648.0 | 0 |
| 1649.0 | 0 |
| 1650.0 | 0 |
| 1651.0 | 0 |
| 1652.0 | 0 |
| 1653.0 | 0 |
| 1654.0 | 0 |
| 1655.0 | 0 |
| 1656.0 | 0 |
| 1657.0 | 0 |
| 1658.0 | 0 |
| 1659.0 | 0 |
| 1660.0 | 0 |
| 1661.0 | 0 |
| 1662.0 | 0 |
| 1663.0 | 0 |
| 1664.0 | 0 |
| 1665.0 | 0 |
| 1666.0 | 0 |
| 1667.0 | 0 |
| 1668.0 | 0 |
| 1669.0 | 0 |
| 1670.0 | 0 |
| 1671.0 | 0 |
| 1672.0 | 0 |
| 1673.0 | 0 |
| 1674.0 | 0 |
| 1675.0 | 0 |
| 1676.0 | 0 |
| 1677.0 | 0 |
| 1678.0 | 0 |
| 1679.0 | 0 |
| 1680.0 | 0 |
| 1681.0 | 0 |
| 1682.0 | 0 |
| 1683.0 | 0 |
| 1684.0 | 0 |
| 1685.0 | 0 |
| 1686.0 | 0 |
| 1687.0 | 0 |
| 1688.0 | 0 |
| 1689.0 | 0 |
| 1690.0 | 0 |
| 1691.0 | 0 |
| 1692.0 | 0 |
| 1693.0 | 0 |
| 1694.0 | 0 |
| 1695.0 | 0 |
| 1696.0 | 0 |
| 1697.0 | 0 |
| 1698.0 | 0 |
| 1699.0 | 0 |
| 1700.0 | 0 |
| 1701.0 | 0 |
| 1702.0 | 0 |
| 1703.0 | 0 |
| 1704.0 | 0 |
| 1705.0 | 0 |
| 1706.0 | 0 |
| 1707.0 | 0 |